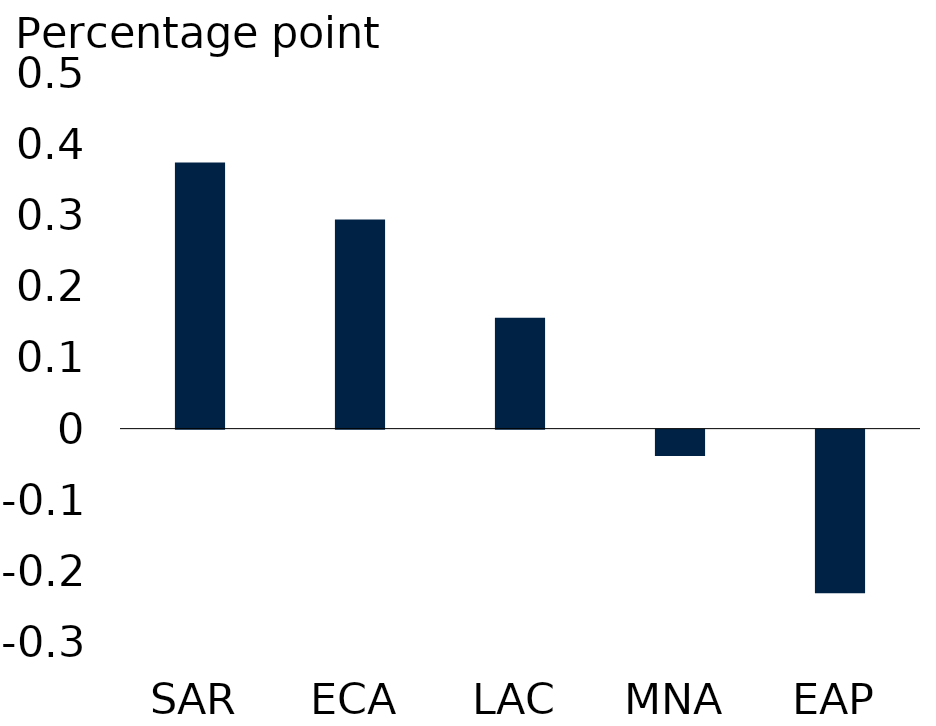
| Category | Series 0 |
|---|---|
| SAR | 0.374 |
| ECA | 0.294 |
| LAC | 0.156 |
| MNA | -0.037 |
| EAP | -0.23 |